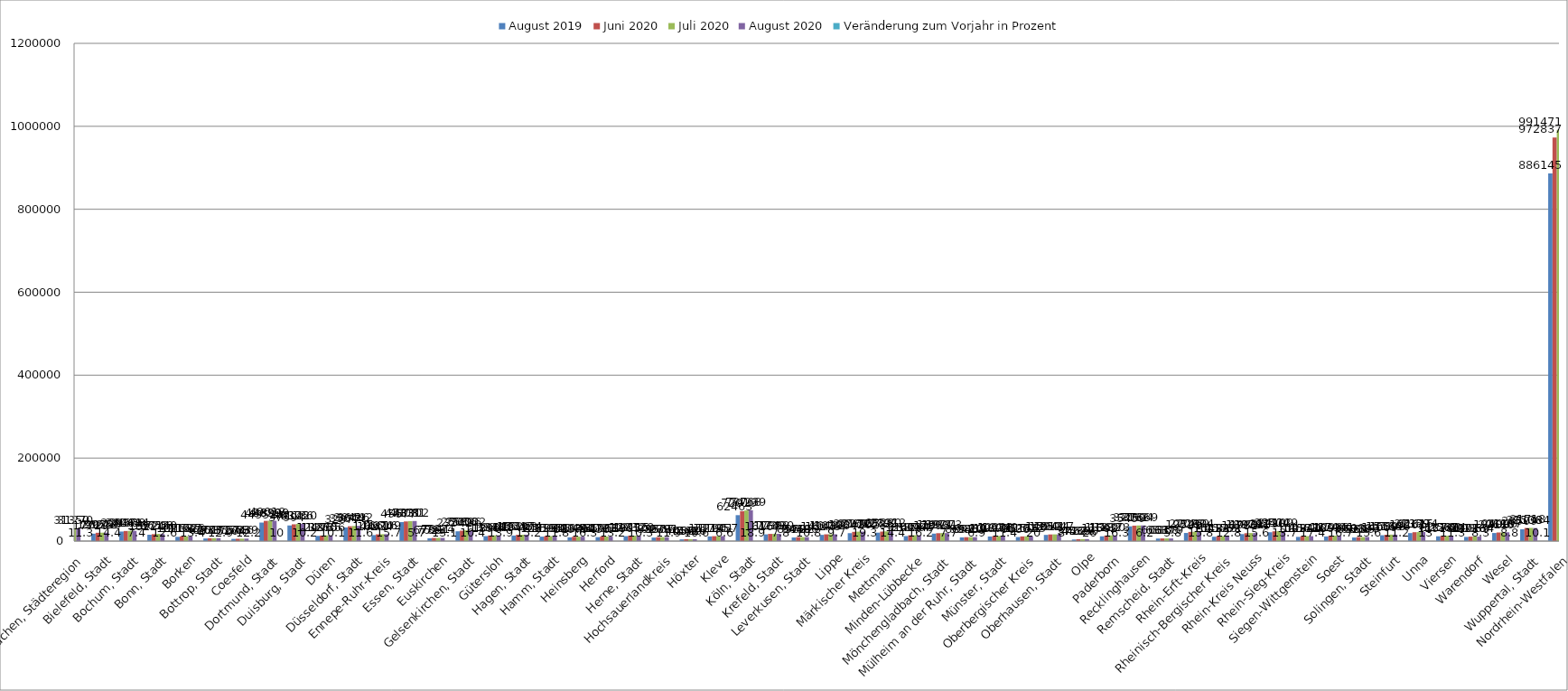
| Category | August 2019 | Juni 2020 | Juli 2020 | August 2020 | Veränderung zum Vorjahr in Prozent |
|---|---|---|---|---|---|
| Aachen, Städteregion | 28087 | 30474 | 31350 | 31270 | 11.3 |
| Bielefeld, Stadt | 17729 | 19955 | 20212 | 20290 | 14.4 |
| Bochum, Stadt | 22937 | 24244 | 24608 | 24634 | 7.4 |
| Bonn, Stadt | 15224 | 16652 | 17208 | 17140 | 12.6 |
| Borken | 10168 | 11192 | 11537 | 11526 | 13.4 |
| Bottrop, Stadt | 6261 | 6933 | 7087 | 7071 | 12.9 |
| Coesfeld | 5204 | 5563 | 5766 | 5839 | 12.2 |
| Dortmund, Stadt | 44552 | 48639 | 49018 | 48999 | 10 |
| Duisburg, Stadt | 37594 | 40375 | 41136 | 41420 | 10.2 |
| Düren | 12496 | 13260 | 13735 | 13756 | 10.1 |
| Düsseldorf, Stadt | 32877 | 35644 | 36416 | 36692 | 11.6 |
| Ennepe-Ruhr-Kreis | 14441 | 16234 | 16616 | 16709 | 15.7 |
| Essen, Stadt | 45677 | 47331 | 48081 | 48302 | 5.7 |
| Euskirchen | 6738 | 7523 | 7641 | 7624 | 13.1 |
| Gelsenkirchen, Stadt | 23542 | 25056 | 25896 | 26002 | 10.4 |
| Gütersloh | 11890 | 13344 | 13648 | 13548 | 13.9 |
| Hagen, Stadt | 13349 | 15043 | 15263 | 15374 | 15.2 |
| Hamm, Stadt | 10655 | 11596 | 11934 | 11916 | 11.8 |
| Heinsberg | 8997 | 10336 | 10494 | 10465 | 16.3 |
| Herford | 9436 | 10723 | 10859 | 10683 | 13.2 |
| Herne, Stadt | 11905 | 12932 | 13115 | 13128 | 10.3 |
| Hochsauerlandkreis | 8387 | 9279 | 9507 | 9381 | 11.9 |
| Höxter | 4057 | 4561 | 4560 | 4486 | 10.6 |
| Kleve | 11214 | 11795 | 11901 | 11957 | 6.6 |
| Köln, Stadt | 62463 | 72019 | 73768 | 74239 | 18.9 |
| Krefeld, Stadt | 16167 | 17239 | 17398 | 17430 | 7.8 |
| Leverkusen, Stadt | 8578 | 9443 | 9602 | 9506 | 10.8 |
| Lippe | 14943 | 16273 | 16433 | 16396 | 9.7 |
| Märkischer Kreis | 19047 | 22164 | 22695 | 22725 | 19.3 |
| Mettmann | 20283 | 22782 | 23280 | 23212 | 14.4 |
| Minden-Lübbecke | 12003 | 13876 | 14134 | 13945 | 16.2 |
| Mönchengladbach, Stadt | 17899 | 18971 | 19331 | 19273 | 7.7 |
| Mülheim an der Ruhr, Stadt | 8857 | 9336 | 9420 | 9469 | 6.9 |
| Münster, Stadt | 10997 | 11899 | 12203 | 12249 | 11.4 |
| Oberbergischer Kreis | 9636 | 11202 | 11502 | 11565 | 20 |
| Oberhausen, Stadt | 14859 | 15941 | 16124 | 16047 | 8 |
| Olpe | 3722 | 4536 | 4678 | 4690 | 26 |
| Paderborn | 11502 | 13182 | 13600 | 13373 | 16.3 |
| Recklinghausen | 35459 | 37162 | 37604 | 37669 | 6.2 |
| Remscheid, Stadt | 6031 | 6337 | 6358 | 6379 | 5.8 |
| Rhein-Erft-Kreis | 19521 | 22028 | 22469 | 22604 | 15.8 |
| Rheinisch-Bergischer Kreis | 10433 | 11555 | 11813 | 11771 | 12.8 |
| Rhein-Kreis Neuss | 16780 | 18878 | 19336 | 19391 | 15.6 |
| Rhein-Sieg-Kreis | 21230 | 23504 | 24199 | 24129 | 13.7 |
| Siegen-Wittgenstein | 10034 | 11563 | 11814 | 11776 | 17.4 |
| Soest | 11093 | 12740 | 12968 | 12941 | 16.7 |
| Solingen, Stadt | 8513 | 9503 | 9695 | 9838 | 15.6 |
| Steinfurt | 14069 | 15186 | 15593 | 15646 | 11.2 |
| Unna | 19261 | 21359 | 21615 | 21774 | 13 |
| Viersen | 11518 | 12567 | 12768 | 12814 | 11.3 |
| Warendorf | 9913 | 10716 | 10859 | 10734 | 8.3 |
| Wesel | 19408 | 20686 | 20906 | 21107 | 8.8 |
| Wuppertal, Stadt | 28509 | 31506 | 31718 | 31384 | 10.1 |
| Nordrhein-Westfalen | 886145 | 972837 | 991471 | 992288 | 12 |